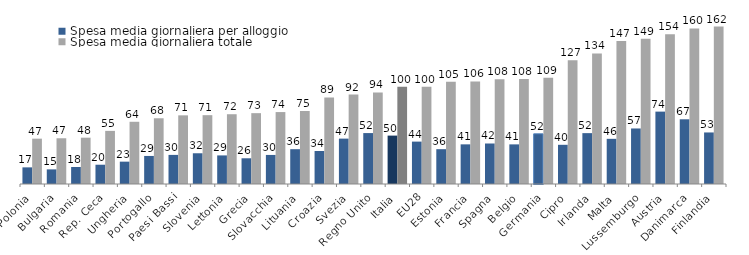
| Category | Spesa media giornaliera per alloggio  | Spesa media giornaliera totale |
|---|---|---|
| Polonia | 17.112 | 46.636 |
| Bulgaria | 15.048 | 47.041 |
| Romania | 17.517 | 47.63 |
| Rep. Ceca | 19.826 | 54.642 |
| Ungheria | 22.987 | 64 |
| Portogallo | 28.849 | 67.607 |
| Paesi Bassi | 29.93 | 70.618 |
| Slovenia | 31.616 | 70.802 |
| Lettonia | 29.401 | 71.771 |
| Grecia | 26.454 | 72.87 |
| Slovacchia | 29.89 | 73.985 |
| Lituania | 35.812 | 75.095 |
| Croazia | 33.932 | 89 |
| Svezia | 46.673 | 91.949 |
| Regno Unito | 52.377 | 94.199 |
| Italia | 49.782 | 100.096 |
| EU28 | 43.6 | 100.149 |
| Estonia | 35.822 | 105.158 |
| Francia | 40.78 | 105.503 |
| Spagna | 41.662 | 107.617 |
| Belgio | 40.758 | 108.107 |
| Germania | 51.611 | 109.398 |
| Cipro | 40.313 | 127.341 |
| Irlanda | 52.319 | 134.256 |
| Malta | 46.454 | 147.193 |
| Lussemburgo | 57.119 | 149.366 |
| Austria | 74.453 | 154 |
| Danimarca | 66.568 | 160 |
| Finlandia | 53.022 | 161.957 |